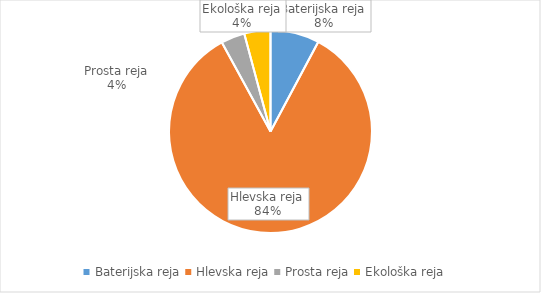
| Category | Količina kosov jajc |
|---|---|
| Baterijska reja | 204463 |
| Hlevska reja | 2209430 |
| Prosta reja | 99232 |
| Ekološka reja | 109440 |